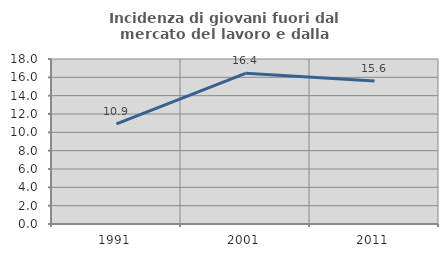
| Category | Incidenza di giovani fuori dal mercato del lavoro e dalla formazione  |
|---|---|
| 1991.0 | 10.926 |
| 2001.0 | 16.434 |
| 2011.0 | 15.602 |